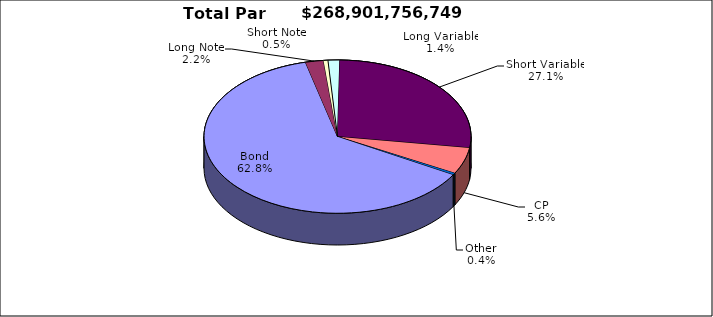
| Category | Par Value |
|---|---|
| Bond | 168881036690 |
| Long Note | 5888982684 |
| Short Note | 1423158348 |
| Long Variable | 3817994000 |
| Short Variable | 72801178122 |
| CP | 15009801000 |
| Other | 1079605905 |